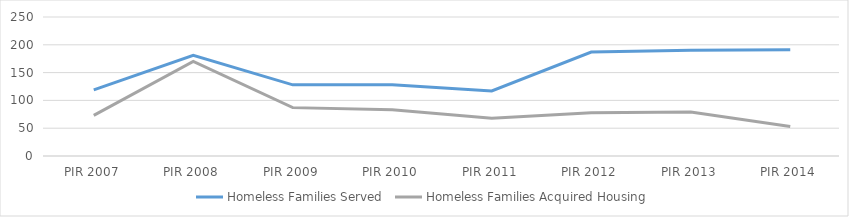
| Category | Homeless Families Served | Homeless Families Acquired Housing |
|---|---|---|
| PIR 2007 | 119 | 73 |
| PIR 2008 | 181 | 170 |
| PIR 2009 | 128 | 87 |
| PIR 2010 | 128 | 83 |
| PIR 2011 | 117 | 68 |
| PIR 2012 | 187 | 78 |
| PIR 2013 | 190 | 79 |
| PIR 2014 | 191 | 53 |